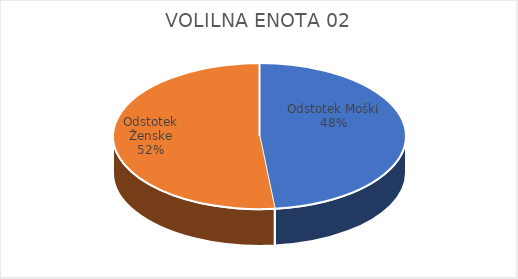
| Category | VOLILNA ENOTA 02 | #REF! | Slovenija skupaj |
|---|---|---|---|
| Odstotek Moški | 13.75 |  | 13.7 |
| Odstotek Ženske | 14.69 |  | 14.52 |